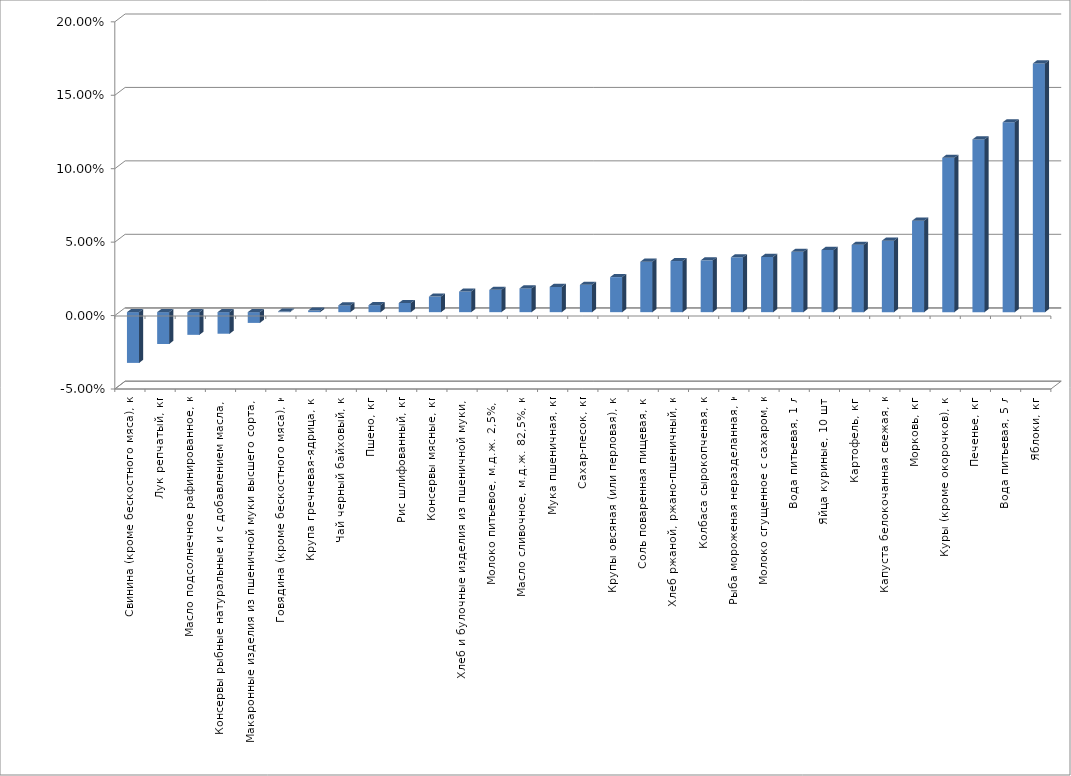
| Category | Series 0 |
|---|---|
| Свинина (кроме бескостного мяса), кг | -0.035 |
| Лук репчатый, кг | -0.022 |
| Масло подсолнечное рафинированное, кг | -0.015 |
| Консервы рыбные натуральные и с добавлением масла, кг | -0.015 |
| Макаронные изделия из пшеничной муки высшего сорта, кг | -0.007 |
| Говядина (кроме бескостного мяса), кг | 0 |
| Крупа гречневая-ядрица, кг | 0.001 |
| Чай черный байховый, кг | 0.005 |
| Пшено, кг | 0.005 |
| Рис шлифованный, кг | 0.006 |
| Консервы мясные, кг | 0.011 |
| Хлеб и булочные изделия из пшеничной муки, кг | 0.014 |
| Молоко питьевое, м.д.ж. 2,5%, л | 0.015 |
| Масло сливочное, м.д.ж. 82,5%, кг | 0.016 |
| Мука пшеничная, кг | 0.017 |
| Сахар-песок, кг | 0.019 |
| Крупы овсяная (или перловая), кг | 0.024 |
| Соль поваренная пищевая, кг | 0.034 |
| Хлеб ржаной, ржано-пшеничный, кг | 0.035 |
| Колбаса сырокопченая, кг | 0.035 |
| Рыба мороженая неразделанная, кг | 0.037 |
| Молоко сгущенное с сахаром, кг | 0.038 |
| Вода питьевая, 1 л | 0.041 |
| Яйца куриные, 10 шт. | 0.042 |
| Картофель, кг | 0.046 |
| Капуста белокочанная свежая, кг | 0.049 |
| Морковь, кг | 0.062 |
| Куры (кроме окорочков), кг | 0.105 |
| Печенье, кг | 0.118 |
| Вода питьевая, 5 л | 0.129 |
| Яблоки, кг | 0.169 |